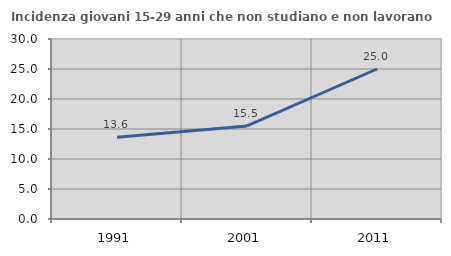
| Category | Incidenza giovani 15-29 anni che non studiano e non lavorano  |
|---|---|
| 1991.0 | 13.61 |
| 2001.0 | 15.504 |
| 2011.0 | 25 |